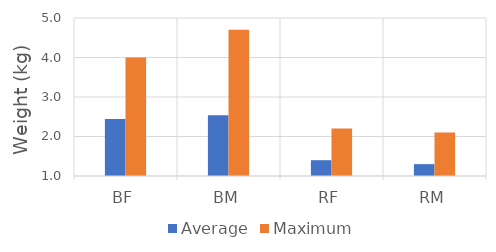
| Category | Average | Maximum |
|---|---|---|
| BF | 2.44 | 4 |
| BM | 2.54 | 4.7 |
| RF | 1.4 | 2.2 |
| RM | 1.3 | 2.1 |